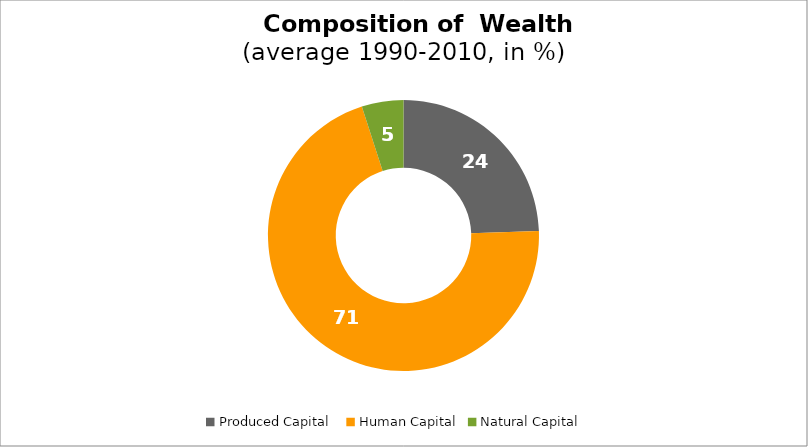
| Category | Series 0 |
|---|---|
| Produced Capital  | 24.459 |
| Human Capital | 70.568 |
| Natural Capital | 4.973 |